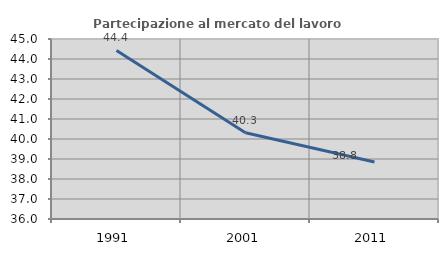
| Category | Partecipazione al mercato del lavoro  femminile |
|---|---|
| 1991.0 | 44.427 |
| 2001.0 | 40.316 |
| 2011.0 | 38.849 |